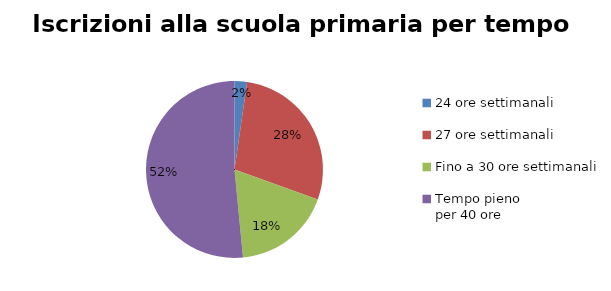
| Category | Series 0 |
|---|---|
| 24 ore settimanali | 871 |
| 27 ore settimanali | 10794 |
| Fino a 30 ore settimanali | 6874 |
| Tempo pieno 
per 40 ore | 19713 |